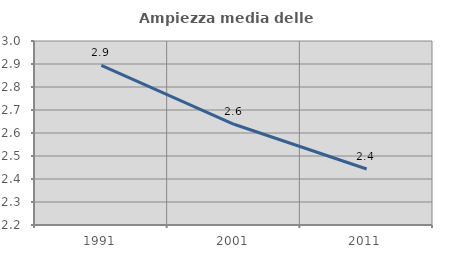
| Category | Ampiezza media delle famiglie |
|---|---|
| 1991.0 | 2.894 |
| 2001.0 | 2.638 |
| 2011.0 | 2.443 |